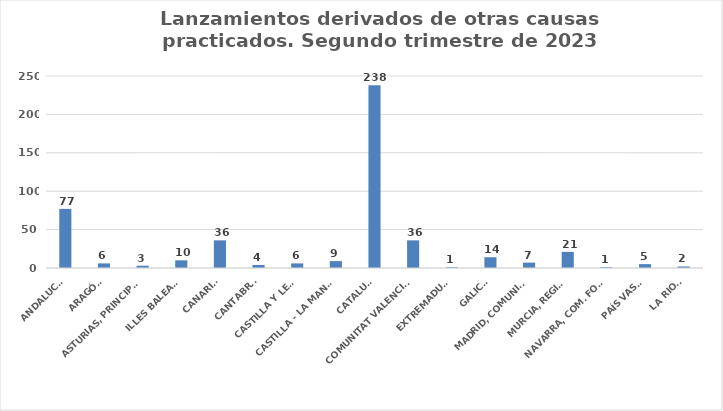
| Category | Series 0 |
|---|---|
| ANDALUCÍA | 77 |
| ARAGÓN | 6 |
| ASTURIAS, PRINCIPADO | 3 |
| ILLES BALEARS | 10 |
| CANARIAS | 36 |
| CANTABRIA | 4 |
| CASTILLA Y LEÓN | 6 |
| CASTILLA - LA MANCHA | 9 |
| CATALUÑA | 238 |
| COMUNITAT VALENCIANA | 36 |
| EXTREMADURA | 1 |
| GALICIA | 14 |
| MADRID, COMUNIDAD | 7 |
| MURCIA, REGIÓN | 21 |
| NAVARRA, COM. FORAL | 1 |
| PAÍS VASCO | 5 |
| LA RIOJA | 2 |